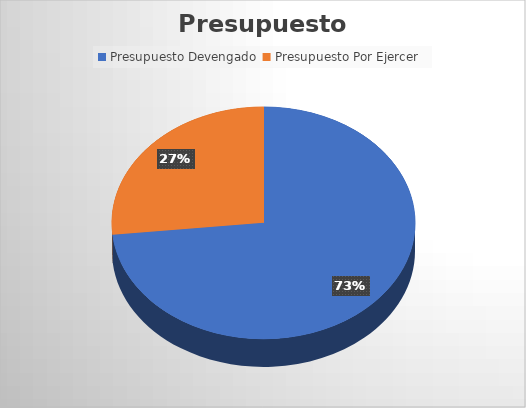
| Category | Monto  |
|---|---|
| Presupuesto Devengado  | 453620382.96 |
| Presupuesto Por Ejercer  | 164541470.55 |